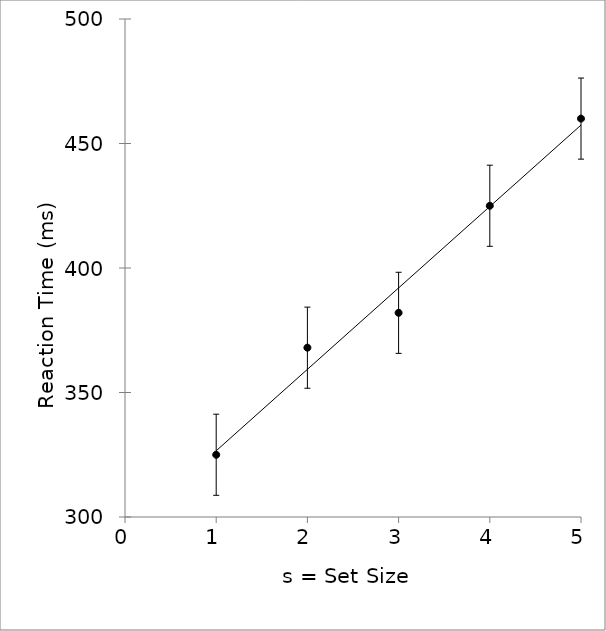
| Category | Within |
|---|---|
| 1.0 | 325 |
| 2.0 | 368 |
| 3.0 | 382 |
| 4.0 | 425 |
| 5.0 | 460 |